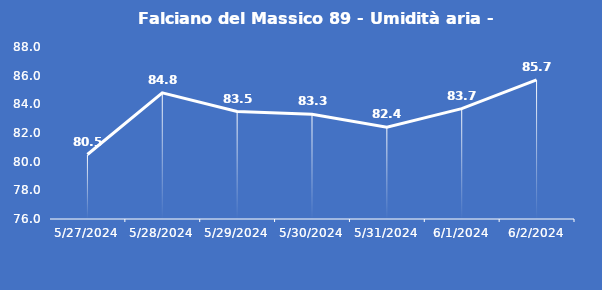
| Category | Falciano del Massico 89 - Umidità aria - Grezzo (%) |
|---|---|
| 5/27/24 | 80.5 |
| 5/28/24 | 84.8 |
| 5/29/24 | 83.5 |
| 5/30/24 | 83.3 |
| 5/31/24 | 82.4 |
| 6/1/24 | 83.7 |
| 6/2/24 | 85.7 |